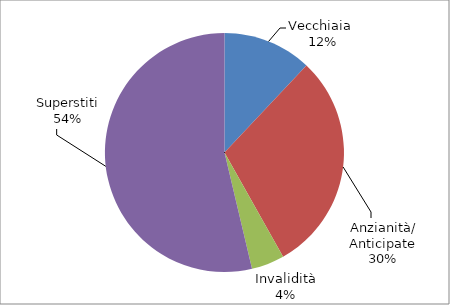
| Category | Series 0 |
|---|---|
| Vecchiaia  | 3403 |
| Anzianità/ Anticipate | 8441 |
| Invalidità | 1261 |
| Superstiti | 15199 |